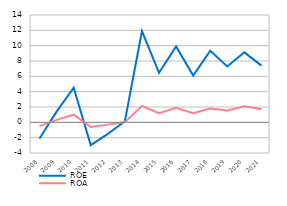
| Category | ROE | ROA |
|---|---|---|
| 2008.0 | -2.11 | -0.496 |
| 2009.0 | 1.39 | 0.32 |
| 2010.0 | 4.51 | 0.993 |
| 2011.0 | -2.97 | -0.606 |
| 2012.0 | -1.5 | -0.3 |
| 2013.0 | 0.14 | 0.03 |
| 2014.0 | 11.9 | 2.13 |
| 2015.0 | 6.45 | 1.18 |
| 2016.0 | 9.9 | 1.9 |
| 2017.0 | 6.1 | 1.2 |
| 2018.0 | 9.34 | 1.8 |
| 2019.0 | 7.29 | 1.56 |
| 2020.0 | 9.13 | 2.08 |
| 2021.0 | 7.4 | 1.7 |